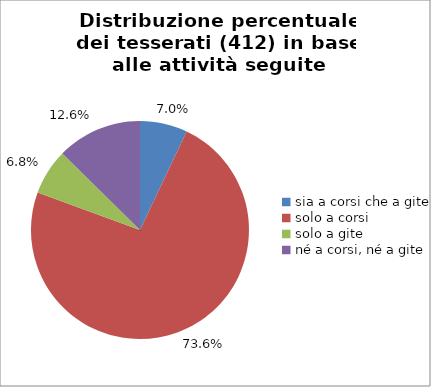
| Category | Nr. Tesserati |
|---|---|
| sia a corsi che a gite | 29 |
| solo a corsi | 303 |
| solo a gite | 28 |
| né a corsi, né a gite | 52 |